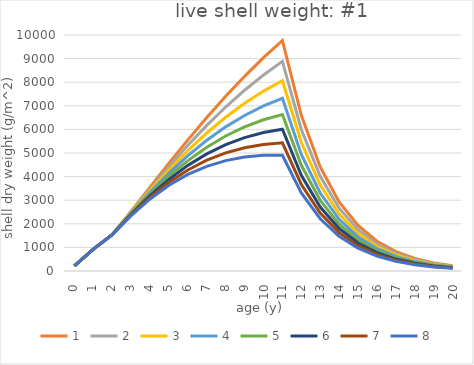
| Category | 1 | 2 | 3 | 4 | 5 | 6 | 7 | 8 |
|---|---|---|---|---|---|---|---|---|
| 0.0 | 218.885 | 218.885 | 218.885 | 218.885 | 218.885 | 218.885 | 218.885 | 218.885 |
| 1.0 | 927.597 | 927.597 | 927.597 | 927.597 | 927.597 | 927.597 | 927.597 | 927.597 |
| 2.0 | 1541.282 | 1541.282 | 1541.282 | 1541.282 | 1541.282 | 1541.282 | 1541.282 | 1541.282 |
| 3.0 | 2535.375 | 2508.687 | 2481.999 | 2455.31 | 2428.622 | 2401.934 | 2375.246 | 2348.558 |
| 4.0 | 3555.815 | 3481.349 | 3407.672 | 3334.783 | 3262.681 | 3191.368 | 3120.843 | 3051.106 |
| 5.0 | 4569.658 | 4426.867 | 4287.081 | 4150.27 | 4016.401 | 3885.442 | 3757.361 | 3632.126 |
| 6.0 | 5556.773 | 5326.472 | 5103.405 | 4887.419 | 4678.362 | 4476.085 | 4280.439 | 4091.278 |
| 7.0 | 6504.225 | 6169.029 | 5847.797 | 5540.088 | 5245.471 | 4963.524 | 4693.833 | 4435.994 |
| 8.0 | 7403.604 | 6948.142 | 6516.273 | 6107.008 | 5719.393 | 5352.499 | 5005.432 | 4677.325 |
| 9.0 | 8249.543 | 7660.544 | 7107.965 | 6589.909 | 6104.56 | 5650.179 | 5225.101 | 4827.734 |
| 10.0 | 9038.813 | 8305.11 | 7624.057 | 6992.382 | 6406.985 | 5864.927 | 5363.43 | 4899.863 |
| 11.0 | 9769.735 | 8882.209 | 8067.089 | 7319.152 | 6633.502 | 6005.552 | 5431.007 | 4905.851 |
| 12.0 | 6594.8 | 5995.699 | 5445.474 | 4940.599 | 4477.769 | 4053.888 | 3666.057 | 3311.565 |
| 13.0 | 4409.837 | 4009.228 | 3641.301 | 3303.699 | 2994.212 | 2710.77 | 2451.433 | 2214.39 |
| 14.0 | 2925.186 | 2659.449 | 2415.391 | 2191.449 | 1986.157 | 1798.14 | 1626.114 | 1468.876 |
| 15.0 | 1926.976 | 1751.921 | 1591.148 | 1443.625 | 1308.388 | 1184.531 | 1071.208 | 967.627 |
| 16.0 | 1261.769 | 1147.145 | 1041.871 | 945.274 | 856.722 | 775.622 | 701.419 | 633.595 |
| 17.0 | 821.83 | 747.171 | 678.603 | 615.687 | 558.01 | 505.187 | 456.856 | 412.68 |
| 18.0 | 532.777 | 484.377 | 439.926 | 399.138 | 361.748 | 327.503 | 296.171 | 267.533 |
| 19.0 | 343.947 | 312.701 | 284.005 | 257.673 | 233.535 | 211.427 | 191.2 | 172.712 |
| 20.0 | 221.211 | 201.115 | 182.659 | 165.723 | 150.199 | 135.98 | 122.971 | 111.08 |